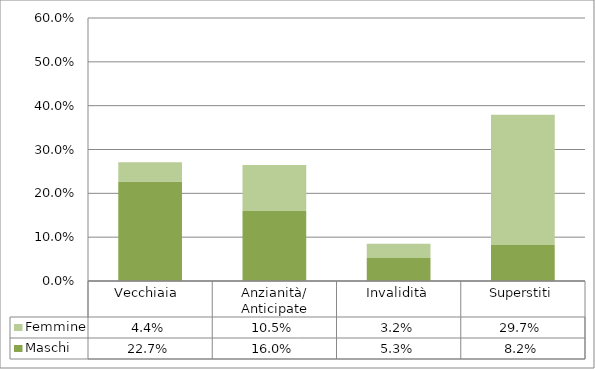
| Category | Maschi | Femmine |
|---|---|---|
| Vecchiaia  | 0.227 | 0.044 |
| Anzianità/ Anticipate | 0.16 | 0.105 |
| Invalidità | 0.053 | 0.032 |
| Superstiti | 0.082 | 0.297 |